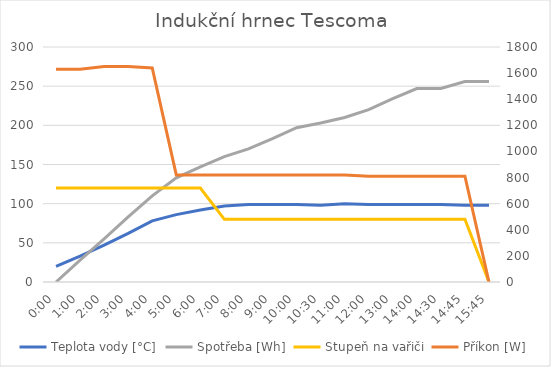
| Category | Teplota vody [°C] | Spotřeba [Wh] | Stupeň na vařiči |
|---|---|---|---|
| 0.0 | 20 | 0 | 120 |
| 0.041666666666666664 | 33 | 28 | 120 |
| 0.08333333333333333 | 47 | 55 | 120 |
| 0.125 | 62 | 83 | 120 |
| 0.16666666666666666 | 78 | 110 | 120 |
| 0.208333333333333 | 86 | 133 | 120 |
| 0.25 | 92 | 147 | 120 |
| 0.291666666666667 | 97 | 160 | 80 |
| 0.333333333333333 | 99 | 170 | 80 |
| 0.375 | 99 | 183 | 80 |
| 0.416666666666667 | 99 | 197 | 80 |
| 0.4375 | 98 | 203 | 80 |
| 0.458333333333333 | 100 | 210 | 80 |
| 0.5 | 99 | 220 | 80 |
| 0.541666666666667 | 99 | 234 | 80 |
| 0.583333333333333 | 99 | 247 | 80 |
| 0.6041666666666666 | 99 | 247 | 80 |
| 0.6145833333333334 | 98 | 256 | 80 |
| 0.65625 | 98 | 256 | 0 |